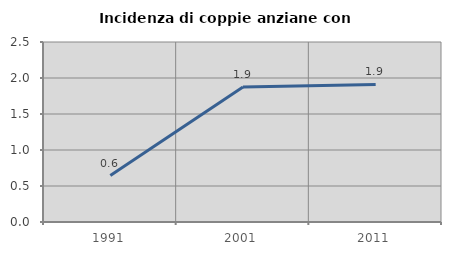
| Category | Incidenza di coppie anziane con figli |
|---|---|
| 1991.0 | 0.645 |
| 2001.0 | 1.875 |
| 2011.0 | 1.911 |